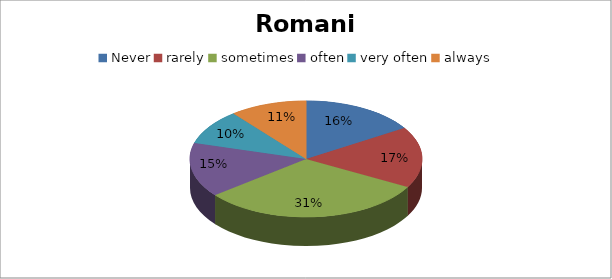
| Category | Series 0 |
|---|---|
| Never | 18 |
| rarely | 19 |
| sometimes | 35 |
| often | 17 |
| very often | 11 |
| always | 12 |